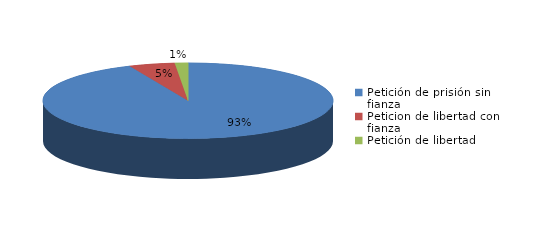
| Category | Series 0 |
|---|---|
| Petición de prisión sin fianza | 128 |
| Peticion de libertad con fianza | 7 |
| Petición de libertad | 2 |